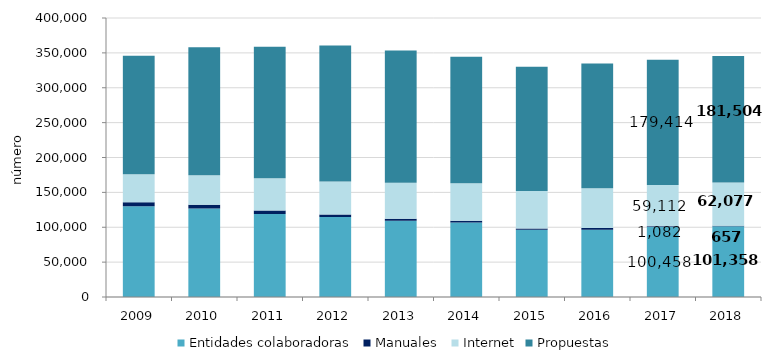
| Category | Entidades colaboradoras | Manuales  | Internet | Propuestas |
|---|---|---|---|---|
| 2009.0 | 130077 | 5880 | 40173 | 169670 |
| 2010.0 | 126722 | 5687 | 42319 | 183242 |
| 2011.0 | 118944 | 5162 | 46264 | 188235 |
| 2012.0 | 114561 | 3580 | 47321 | 195282 |
| 2013.0 | 109332 | 3012 | 51592 | 189526 |
| 2014.0 | 106945 | 2347 | 53742 | 181366 |
| 2015.0 | 96432 | 1819 | 53598 | 178257 |
| 2016.0 | 96513 | 2276 | 57092 | 179060 |
| 2017.0 | 100458 | 1082 | 59112 | 179414 |
| 2018.0 | 101358 | 657 | 62077 | 181504 |